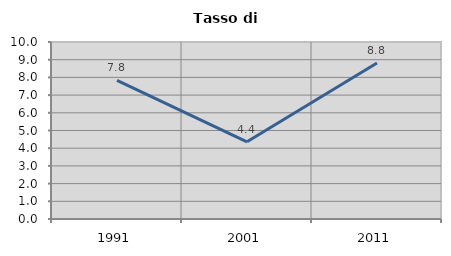
| Category | Tasso di disoccupazione   |
|---|---|
| 1991.0 | 7.837 |
| 2001.0 | 4.363 |
| 2011.0 | 8.817 |